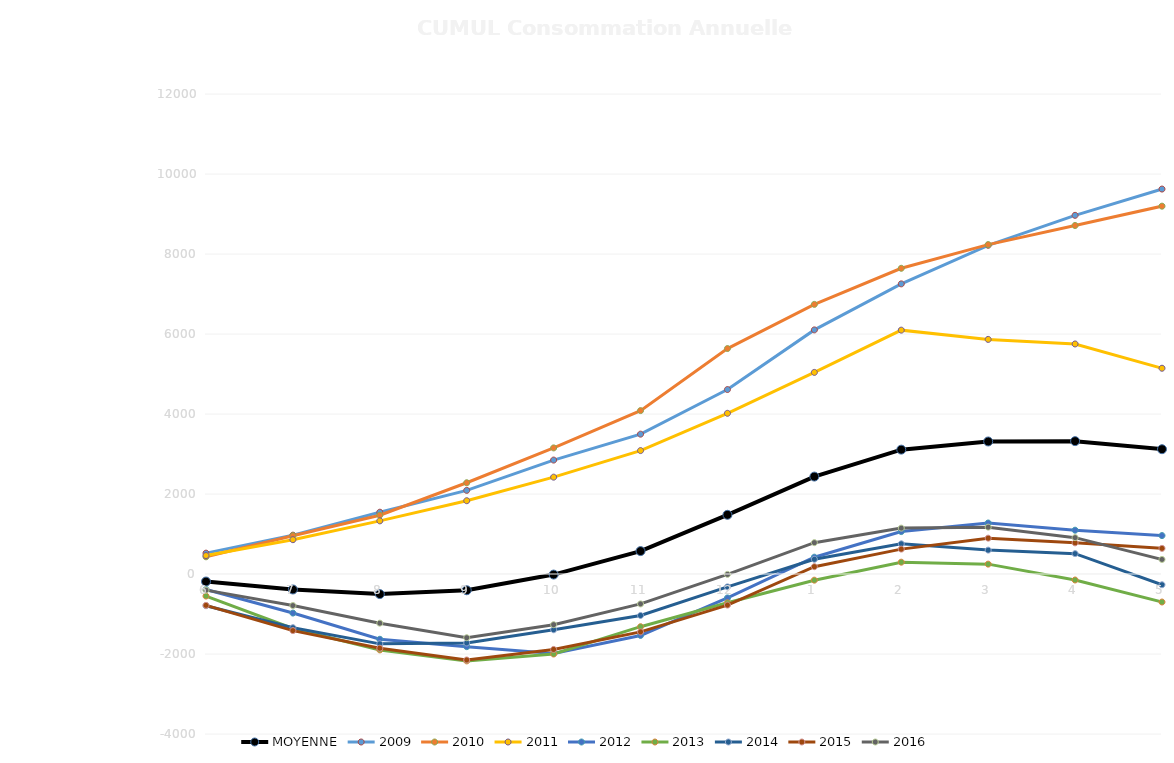
| Category | MOYENNE | 2009 | 2010 | 2011 | 2012 | 2013 | 2014 | 2015 | 2016 |
|---|---|---|---|---|---|---|---|---|---|
| 6 | -188.25 | 521.471 | 430.25 | 461 | -387.062 | -551.344 | -793.333 | -784 | -403.077 |
| 7 | -387.25 | 971.382 | 956.714 | 857.972 | -976.6 | -1361.344 | -1342 | -1415 | -788.815 |
| 8 | -502.25 | 1545.079 | 1470 | 1328.467 | -1632 | -1897.915 | -1746.632 | -1855.049 | -1228.786 |
| 9 | -406.375 | 2090.618 | 2280.909 | 1832.133 | -1816.125 | -2172.344 | -1724 | -2149.8 | -1593 |
| 10 | -14.125 | 2848.18 | 3152.533 | 2421.1 | -1988 | -1999.906 | -1394 | -1885.63 | -1267 |
| 11 | 572.75 | 3496.118 | 4084.875 | 3085.536 | -1536 | -1317.344 | -1037 | -1447.419 | -747.909 |
| 12 | 1479.875 | 4611.618 | 5636.345 | 4017.375 | -599 | -720.344 | -321.182 | -777.194 | -9 |
| 1 | 2435.5 | 6102.618 | 6740.567 | 5040 | 420 | -154.344 | 367.833 | 182.839 | 783.324 |
| 2 | 3109 | 7253.418 | 7642.6 | 6096.2 | 1060.387 | 295.656 | 755 | 622 | 1147 |
| 3 | 3313 | 8217.618 | 8234.6 | 5865 | 1275 | 246.656 | 597.1 | 896.156 | 1171.424 |
| 4 | 3321.5 | 8966.68 | 8712.75 | 5751 | 1095 | -150.344 | 509 | 778.367 | 909 |
| 5 | 3120 | 9623.618 | 9196 | 5144 | 960.344 | -700.344 | -269 | 641 | 364 |